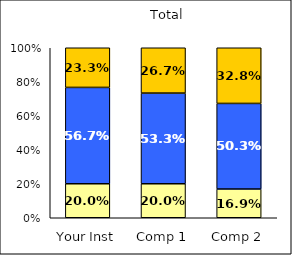
| Category | Low Student-Centered Pedagogy | Average Student-Centered Pedagogy | High Student-Centered Pedagogy |
|---|---|---|---|
| Your Inst | 0.2 | 0.567 | 0.233 |
| Comp 1 | 0.2 | 0.533 | 0.267 |
| Comp 2 | 0.169 | 0.503 | 0.328 |